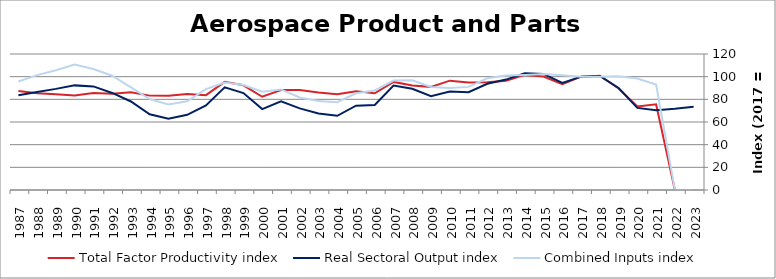
| Category | Total Factor Productivity index | Real Sectoral Output index | Combined Inputs index |
|---|---|---|---|
| 2023.0 | 0 | 73.529 | 0 |
| 2022.0 | 0 | 71.727 | 0 |
| 2021.0 | 75.648 | 70.344 | 92.988 |
| 2020.0 | 73.644 | 72.45 | 98.378 |
| 2019.0 | 89.629 | 90.034 | 100.451 |
| 2018.0 | 100.806 | 100.661 | 99.857 |
| 2017.0 | 100 | 100 | 100 |
| 2016.0 | 93.359 | 94.542 | 101.268 |
| 2015.0 | 100.175 | 102.45 | 102.272 |
| 2014.0 | 101.555 | 103.076 | 101.498 |
| 2013.0 | 96.476 | 97.415 | 100.973 |
| 2012.0 | 95.031 | 93.7 | 98.6 |
| 2011.0 | 94.897 | 86.35 | 90.993 |
| 2010.0 | 96.464 | 86.864 | 90.049 |
| 2009.0 | 91.003 | 82.785 | 90.969 |
| 2008.0 | 92.249 | 89.337 | 96.844 |
| 2007.0 | 95.381 | 92.112 | 96.573 |
| 2006.0 | 85.376 | 75.011 | 87.86 |
| 2005.0 | 87.217 | 74.409 | 85.314 |
| 2004.0 | 84.492 | 65.477 | 77.495 |
| 2003.0 | 85.997 | 67.579 | 78.583 |
| 2002.0 | 88.198 | 72.051 | 81.692 |
| 2001.0 | 88.243 | 78.289 | 88.72 |
| 2000.0 | 82.284 | 71.395 | 86.766 |
| 1999.0 | 92.376 | 85.511 | 92.568 |
| 1998.0 | 95.442 | 90.579 | 94.904 |
| 1997.0 | 83.713 | 74.541 | 89.044 |
| 1996.0 | 84.745 | 66.334 | 78.274 |
| 1995.0 | 83.144 | 62.802 | 75.534 |
| 1994.0 | 83.272 | 66.82 | 80.242 |
| 1993.0 | 86.289 | 78.115 | 90.527 |
| 1992.0 | 84.934 | 85.641 | 100.832 |
| 1991.0 | 85.685 | 91.42 | 106.693 |
| 1990.0 | 83.338 | 92.313 | 110.77 |
| 1989.0 | 84.444 | 89.215 | 105.65 |
| 1988.0 | 85.352 | 86.531 | 101.381 |
| 1987.0 | 87.334 | 83.633 | 95.761 |